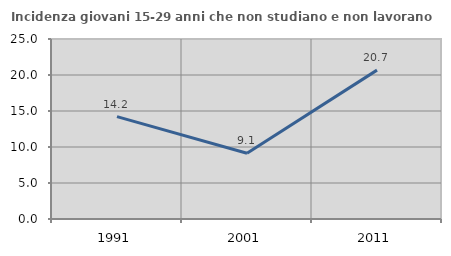
| Category | Incidenza giovani 15-29 anni che non studiano e non lavorano  |
|---|---|
| 1991.0 | 14.224 |
| 2001.0 | 9.125 |
| 2011.0 | 20.678 |